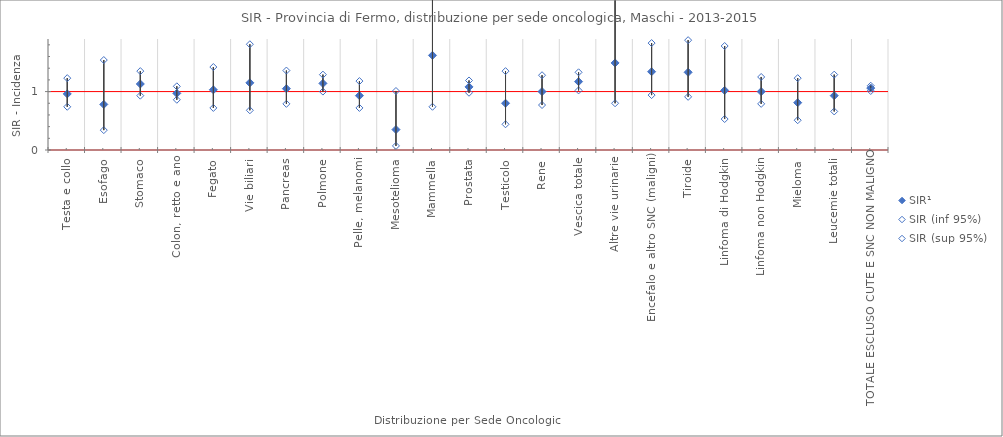
| Category | SIR¹ | SIR (inf 95%) | SIR (sup 95%) |
|---|---|---|---|
| Testa e collo | 0.96 | 0.74 | 1.23 |
| Esofago | 0.78 | 0.34 | 1.54 |
| Stomaco | 1.13 | 0.93 | 1.35 |
| Colon, retto e ano | 0.97 | 0.86 | 1.09 |
| Fegato | 1.03 | 0.72 | 1.42 |
| Vie biliari | 1.15 | 0.68 | 1.81 |
| Pancreas | 1.05 | 0.79 | 1.36 |
| Polmone | 1.14 | 1 | 1.29 |
| Pelle, melanomi | 0.93 | 0.72 | 1.18 |
| Mesotelioma | 0.35 | 0.07 | 1.01 |
| Mammella | 1.62 | 0.74 | 3.08 |
| Prostata | 1.08 | 0.98 | 1.19 |
| Testicolo | 0.8 | 0.44 | 1.35 |
| Rene | 1 | 0.77 | 1.28 |
| Vescica totale | 1.17 | 1.02 | 1.33 |
| Altre vie urinarie | 1.49 | 0.8 | 2.56 |
| Encefalo e altro SNC (maligni) | 1.34 | 0.94 | 1.83 |
| Tiroide | 1.33 | 0.91 | 1.88 |
| Linfoma di Hodgkin | 1.02 | 0.53 | 1.78 |
| Linfoma non Hodgkin | 1 | 0.79 | 1.25 |
| Mieloma | 0.81 | 0.51 | 1.23 |
| Leucemie totali | 0.93 | 0.66 | 1.29 |
| TOTALE ESCLUSO CUTE E SNC NON MALIGNO | 1.06 | 1.01 | 1.1 |